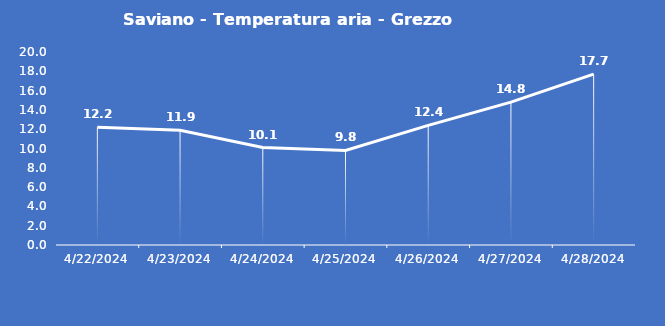
| Category | Saviano - Temperatura aria - Grezzo (°C) |
|---|---|
| 4/22/24 | 12.2 |
| 4/23/24 | 11.9 |
| 4/24/24 | 10.1 |
| 4/25/24 | 9.8 |
| 4/26/24 | 12.4 |
| 4/27/24 | 14.8 |
| 4/28/24 | 17.7 |